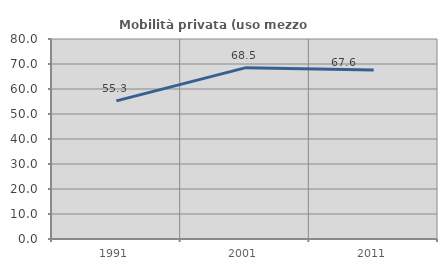
| Category | Mobilità privata (uso mezzo privato) |
|---|---|
| 1991.0 | 55.257 |
| 2001.0 | 68.468 |
| 2011.0 | 67.615 |